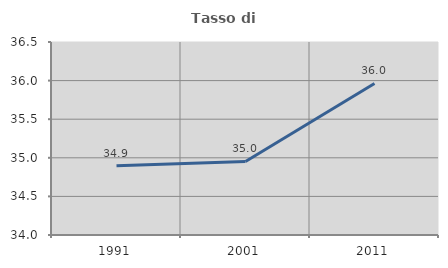
| Category | Tasso di occupazione   |
|---|---|
| 1991.0 | 34.898 |
| 2001.0 | 34.953 |
| 2011.0 | 35.963 |